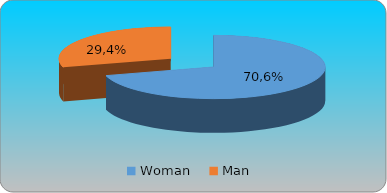
| Category | Series 0 | Series 1 | Series 2 | Series 3 |
|---|---|---|---|---|
| Woman     | 0.706 |  |  |  |
| Man  | 0.294 |  |  |  |